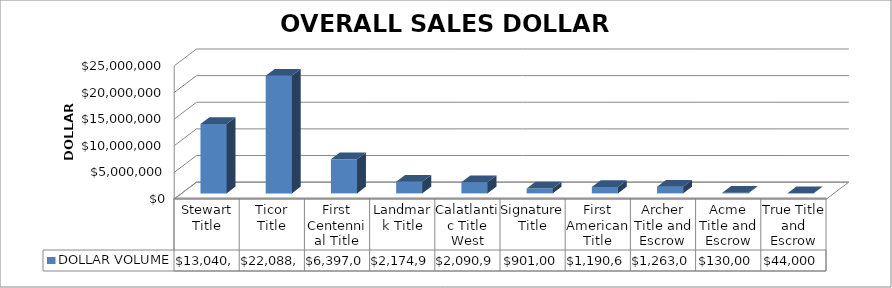
| Category | DOLLAR VOLUME |
|---|---|
| Stewart Title | 13040358 |
| Ticor Title | 22088699.33 |
| First Centennial Title | 6397084 |
| Landmark Title | 2174900 |
| Calatlantic Title West | 2090907 |
| Signature Title | 901000 |
| First American Title | 1190610 |
| Archer Title and Escrow | 1263000 |
| Acme Title and Escrow | 130000 |
| True Title and Escrow | 44000 |